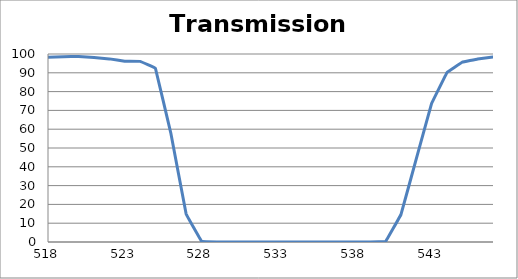
| Category | Transmission (%) |
|---|---|
| 2600.0 | 66.434 |
| 2599.0 | 66.421 |
| 2598.0 | 66.411 |
| 2597.0 | 66.37 |
| 2596.0 | 66.272 |
| 2595.0 | 66.179 |
| 2594.0 | 66.079 |
| 2593.0 | 65.983 |
| 2592.0 | 65.845 |
| 2591.0 | 65.765 |
| 2590.0 | 65.655 |
| 2589.0 | 65.601 |
| 2588.0 | 65.577 |
| 2587.0 | 65.482 |
| 2586.0 | 65.346 |
| 2585.0 | 65.191 |
| 2584.0 | 65.07 |
| 2583.0 | 64.915 |
| 2582.0 | 64.859 |
| 2581.0 | 64.767 |
| 2580.0 | 64.738 |
| 2579.0 | 64.683 |
| 2578.0 | 64.631 |
| 2577.0 | 64.623 |
| 2576.0 | 64.59 |
| 2575.0 | 64.598 |
| 2574.0 | 64.605 |
| 2573.0 | 64.634 |
| 2572.0 | 64.678 |
| 2571.0 | 64.774 |
| 2570.0 | 64.857 |
| 2569.0 | 65.033 |
| 2568.0 | 65.207 |
| 2567.0 | 65.389 |
| 2566.0 | 65.6 |
| 2565.0 | 65.81 |
| 2564.0 | 66.028 |
| 2563.0 | 66.29 |
| 2562.0 | 66.575 |
| 2561.0 | 66.826 |
| 2560.0 | 67.062 |
| 2559.0 | 67.328 |
| 2558.0 | 67.622 |
| 2557.0 | 67.91 |
| 2556.0 | 68.236 |
| 2555.0 | 68.53 |
| 2554.0 | 68.852 |
| 2553.0 | 69.226 |
| 2552.0 | 69.63 |
| 2551.0 | 70.064 |
| 2550.0 | 70.535 |
| 2549.0 | 70.997 |
| 2548.0 | 71.46 |
| 2547.0 | 71.886 |
| 2546.0 | 72.279 |
| 2545.0 | 72.675 |
| 2544.0 | 73.071 |
| 2543.0 | 73.428 |
| 2542.0 | 73.762 |
| 2541.0 | 74.049 |
| 2540.0 | 74.321 |
| 2539.0 | 74.558 |
| 2538.0 | 74.798 |
| 2537.0 | 75.017 |
| 2536.0 | 75.232 |
| 2535.0 | 75.435 |
| 2534.0 | 75.586 |
| 2533.0 | 75.68 |
| 2532.0 | 75.816 |
| 2531.0 | 75.972 |
| 2530.0 | 76.04 |
| 2529.0 | 76.068 |
| 2528.0 | 76.114 |
| 2527.0 | 76.123 |
| 2526.0 | 76.093 |
| 2525.0 | 76.093 |
| 2524.0 | 76.089 |
| 2523.0 | 76.062 |
| 2522.0 | 75.999 |
| 2521.0 | 75.884 |
| 2520.0 | 75.782 |
| 2519.0 | 75.693 |
| 2518.0 | 75.581 |
| 2517.0 | 75.5 |
| 2516.0 | 75.422 |
| 2515.0 | 75.315 |
| 2514.0 | 75.215 |
| 2513.0 | 75.152 |
| 2512.0 | 75.091 |
| 2511.0 | 75.052 |
| 2510.0 | 75.006 |
| 2509.0 | 74.962 |
| 2508.0 | 74.939 |
| 2507.0 | 74.938 |
| 2506.0 | 74.953 |
| 2505.0 | 75.004 |
| 2504.0 | 75.059 |
| 2503.0 | 75.132 |
| 2502.0 | 75.2 |
| 2501.0 | 75.283 |
| 2500.0 | 75.403 |
| 2499.0 | 75.562 |
| 2498.0 | 75.76 |
| 2497.0 | 75.947 |
| 2496.0 | 76.165 |
| 2495.0 | 76.369 |
| 2494.0 | 76.574 |
| 2493.0 | 76.79 |
| 2492.0 | 77.05 |
| 2491.0 | 77.321 |
| 2490.0 | 77.625 |
| 2489.0 | 77.936 |
| 2488.0 | 78.25 |
| 2487.0 | 78.537 |
| 2486.0 | 78.805 |
| 2485.0 | 79.115 |
| 2484.0 | 79.486 |
| 2483.0 | 79.818 |
| 2482.0 | 80.132 |
| 2481.0 | 80.444 |
| 2480.0 | 80.758 |
| 2479.0 | 81.055 |
| 2478.0 | 81.355 |
| 2477.0 | 81.637 |
| 2476.0 | 81.93 |
| 2475.0 | 82.203 |
| 2474.0 | 82.478 |
| 2473.0 | 82.719 |
| 2472.0 | 82.942 |
| 2471.0 | 83.151 |
| 2470.0 | 83.367 |
| 2469.0 | 83.612 |
| 2468.0 | 83.813 |
| 2467.0 | 83.938 |
| 2466.0 | 84.035 |
| 2465.0 | 84.149 |
| 2464.0 | 84.264 |
| 2463.0 | 84.37 |
| 2462.0 | 84.465 |
| 2461.0 | 84.518 |
| 2460.0 | 84.539 |
| 2459.0 | 84.569 |
| 2458.0 | 84.616 |
| 2457.0 | 84.636 |
| 2456.0 | 84.661 |
| 2455.0 | 84.658 |
| 2454.0 | 84.645 |
| 2453.0 | 84.64 |
| 2452.0 | 84.627 |
| 2451.0 | 84.613 |
| 2450.0 | 84.592 |
| 2449.0 | 84.587 |
| 2448.0 | 84.603 |
| 2447.0 | 84.599 |
| 2446.0 | 84.56 |
| 2445.0 | 84.529 |
| 2444.0 | 84.517 |
| 2443.0 | 84.516 |
| 2442.0 | 84.509 |
| 2441.0 | 84.491 |
| 2440.0 | 84.468 |
| 2439.0 | 84.43 |
| 2438.0 | 84.389 |
| 2437.0 | 84.36 |
| 2436.0 | 84.349 |
| 2435.0 | 84.354 |
| 2434.0 | 84.358 |
| 2433.0 | 84.343 |
| 2432.0 | 84.296 |
| 2431.0 | 84.261 |
| 2430.0 | 84.234 |
| 2429.0 | 84.196 |
| 2428.0 | 84.148 |
| 2427.0 | 84.099 |
| 2426.0 | 84.054 |
| 2425.0 | 84.013 |
| 2424.0 | 83.953 |
| 2423.0 | 83.88 |
| 2422.0 | 83.817 |
| 2421.0 | 83.74 |
| 2420.0 | 83.644 |
| 2419.0 | 83.565 |
| 2418.0 | 83.498 |
| 2417.0 | 83.429 |
| 2416.0 | 83.373 |
| 2415.0 | 83.31 |
| 2414.0 | 83.22 |
| 2413.0 | 83.133 |
| 2412.0 | 83.039 |
| 2411.0 | 82.941 |
| 2410.0 | 82.878 |
| 2409.0 | 82.847 |
| 2408.0 | 82.804 |
| 2407.0 | 82.774 |
| 2406.0 | 82.75 |
| 2405.0 | 82.709 |
| 2404.0 | 82.7 |
| 2403.0 | 82.714 |
| 2402.0 | 82.738 |
| 2401.0 | 82.771 |
| 2400.0 | 82.816 |
| 2399.0 | 82.879 |
| 2398.0 | 82.948 |
| 2397.0 | 83.026 |
| 2396.0 | 83.115 |
| 2395.0 | 83.217 |
| 2394.0 | 83.338 |
| 2393.0 | 83.478 |
| 2392.0 | 83.615 |
| 2391.0 | 83.748 |
| 2390.0 | 83.881 |
| 2389.0 | 84.023 |
| 2388.0 | 84.167 |
| 2387.0 | 84.329 |
| 2386.0 | 84.498 |
| 2385.0 | 84.638 |
| 2384.0 | 84.75 |
| 2383.0 | 84.833 |
| 2382.0 | 84.913 |
| 2381.0 | 85.001 |
| 2380.0 | 85.062 |
| 2379.0 | 85.103 |
| 2378.0 | 85.121 |
| 2377.0 | 85.108 |
| 2376.0 | 85.046 |
| 2375.0 | 84.941 |
| 2374.0 | 84.823 |
| 2373.0 | 84.702 |
| 2372.0 | 84.563 |
| 2371.0 | 84.377 |
| 2370.0 | 84.13 |
| 2369.0 | 83.846 |
| 2368.0 | 83.532 |
| 2367.0 | 83.193 |
| 2366.0 | 82.855 |
| 2365.0 | 82.492 |
| 2364.0 | 82.087 |
| 2363.0 | 81.673 |
| 2362.0 | 81.256 |
| 2361.0 | 80.802 |
| 2360.0 | 80.333 |
| 2359.0 | 79.852 |
| 2358.0 | 79.373 |
| 2357.0 | 78.897 |
| 2356.0 | 78.416 |
| 2355.0 | 77.975 |
| 2354.0 | 77.522 |
| 2353.0 | 77.078 |
| 2352.0 | 76.658 |
| 2351.0 | 76.265 |
| 2350.0 | 75.892 |
| 2349.0 | 75.546 |
| 2348.0 | 75.243 |
| 2347.0 | 74.993 |
| 2346.0 | 74.765 |
| 2345.0 | 74.557 |
| 2344.0 | 74.387 |
| 2343.0 | 74.244 |
| 2342.0 | 74.135 |
| 2341.0 | 74.063 |
| 2340.0 | 74.053 |
| 2339.0 | 74.085 |
| 2338.0 | 74.153 |
| 2337.0 | 74.242 |
| 2336.0 | 74.359 |
| 2335.0 | 74.496 |
| 2334.0 | 74.667 |
| 2333.0 | 74.882 |
| 2332.0 | 75.154 |
| 2331.0 | 75.424 |
| 2330.0 | 75.696 |
| 2329.0 | 75.983 |
| 2328.0 | 76.295 |
| 2327.0 | 76.618 |
| 2326.0 | 76.935 |
| 2325.0 | 77.264 |
| 2324.0 | 77.596 |
| 2323.0 | 77.926 |
| 2322.0 | 78.231 |
| 2321.0 | 78.498 |
| 2320.0 | 78.743 |
| 2319.0 | 78.975 |
| 2318.0 | 79.182 |
| 2317.0 | 79.339 |
| 2316.0 | 79.474 |
| 2315.0 | 79.559 |
| 2314.0 | 79.581 |
| 2313.0 | 79.551 |
| 2312.0 | 79.483 |
| 2311.0 | 79.365 |
| 2310.0 | 79.232 |
| 2309.0 | 79.049 |
| 2308.0 | 78.807 |
| 2307.0 | 78.511 |
| 2306.0 | 78.178 |
| 2305.0 | 77.792 |
| 2304.0 | 77.407 |
| 2303.0 | 77.005 |
| 2302.0 | 76.577 |
| 2301.0 | 76.127 |
| 2300.0 | 75.678 |
| 2299.0 | 75.244 |
| 2298.0 | 74.794 |
| 2297.0 | 74.326 |
| 2296.0 | 73.903 |
| 2295.0 | 73.494 |
| 2294.0 | 73.103 |
| 2293.0 | 72.698 |
| 2292.0 | 72.378 |
| 2291.0 | 72.061 |
| 2290.0 | 71.785 |
| 2289.0 | 71.52 |
| 2288.0 | 71.275 |
| 2287.0 | 71.067 |
| 2286.0 | 70.894 |
| 2285.0 | 70.77 |
| 2284.0 | 70.676 |
| 2283.0 | 70.623 |
| 2282.0 | 70.607 |
| 2281.0 | 70.619 |
| 2280.0 | 70.655 |
| 2279.0 | 70.721 |
| 2278.0 | 70.811 |
| 2277.0 | 70.926 |
| 2276.0 | 71.062 |
| 2275.0 | 71.22 |
| 2274.0 | 71.379 |
| 2273.0 | 71.546 |
| 2272.0 | 71.733 |
| 2271.0 | 71.912 |
| 2270.0 | 72.052 |
| 2269.0 | 72.2 |
| 2268.0 | 72.29 |
| 2267.0 | 72.368 |
| 2266.0 | 72.436 |
| 2265.0 | 72.458 |
| 2264.0 | 72.439 |
| 2263.0 | 72.363 |
| 2262.0 | 72.284 |
| 2261.0 | 72.157 |
| 2260.0 | 71.981 |
| 2259.0 | 71.756 |
| 2258.0 | 71.47 |
| 2257.0 | 71.141 |
| 2256.0 | 70.784 |
| 2255.0 | 70.396 |
| 2254.0 | 69.976 |
| 2253.0 | 69.54 |
| 2252.0 | 69.064 |
| 2251.0 | 68.568 |
| 2250.0 | 68.101 |
| 2249.0 | 67.613 |
| 2248.0 | 67.126 |
| 2247.0 | 66.649 |
| 2246.0 | 66.145 |
| 2245.0 | 65.664 |
| 2244.0 | 65.193 |
| 2243.0 | 64.769 |
| 2242.0 | 64.317 |
| 2241.0 | 63.988 |
| 2240.0 | 63.66 |
| 2239.0 | 63.351 |
| 2238.0 | 63.035 |
| 2237.0 | 62.779 |
| 2236.0 | 62.569 |
| 2235.0 | 62.388 |
| 2234.0 | 62.226 |
| 2233.0 | 62.117 |
| 2232.0 | 62.085 |
| 2231.0 | 62.055 |
| 2230.0 | 62.021 |
| 2229.0 | 62.001 |
| 2228.0 | 62.04 |
| 2227.0 | 62.096 |
| 2226.0 | 62.176 |
| 2225.0 | 62.241 |
| 2224.0 | 62.336 |
| 2223.0 | 62.42 |
| 2222.0 | 62.503 |
| 2221.0 | 62.616 |
| 2220.0 | 62.727 |
| 2219.0 | 62.82 |
| 2218.0 | 62.919 |
| 2217.0 | 63.002 |
| 2216.0 | 63.153 |
| 2215.0 | 63.21 |
| 2214.0 | 63.277 |
| 2213.0 | 63.35 |
| 2212.0 | 63.413 |
| 2211.0 | 63.51 |
| 2210.0 | 63.592 |
| 2209.0 | 63.669 |
| 2208.0 | 63.814 |
| 2207.0 | 63.918 |
| 2206.0 | 64.047 |
| 2205.0 | 64.206 |
| 2204.0 | 64.379 |
| 2203.0 | 64.547 |
| 2202.0 | 64.717 |
| 2201.0 | 64.89 |
| 2200.0 | 65.028 |
| 2199.0 | 65.172 |
| 2198.0 | 65.283 |
| 2197.0 | 65.401 |
| 2196.0 | 65.481 |
| 2195.0 | 65.521 |
| 2194.0 | 65.538 |
| 2193.0 | 65.584 |
| 2192.0 | 65.621 |
| 2191.0 | 65.595 |
| 2190.0 | 65.564 |
| 2189.0 | 65.545 |
| 2188.0 | 65.53 |
| 2187.0 | 65.574 |
| 2186.0 | 65.647 |
| 2185.0 | 65.713 |
| 2184.0 | 65.758 |
| 2183.0 | 65.851 |
| 2182.0 | 66.036 |
| 2181.0 | 66.202 |
| 2180.0 | 66.364 |
| 2179.0 | 66.59 |
| 2178.0 | 66.865 |
| 2177.0 | 67.11 |
| 2176.0 | 67.379 |
| 2175.0 | 67.653 |
| 2174.0 | 67.974 |
| 2173.0 | 68.317 |
| 2172.0 | 68.632 |
| 2171.0 | 68.913 |
| 2170.0 | 69.199 |
| 2169.0 | 69.468 |
| 2168.0 | 69.718 |
| 2167.0 | 69.967 |
| 2166.0 | 70.136 |
| 2165.0 | 70.285 |
| 2164.0 | 70.385 |
| 2163.0 | 70.432 |
| 2162.0 | 70.468 |
| 2161.0 | 70.453 |
| 2160.0 | 70.373 |
| 2159.0 | 70.253 |
| 2158.0 | 70.077 |
| 2157.0 | 69.864 |
| 2156.0 | 69.645 |
| 2155.0 | 69.357 |
| 2154.0 | 69.049 |
| 2153.0 | 68.742 |
| 2152.0 | 68.477 |
| 2151.0 | 68.192 |
| 2150.0 | 67.869 |
| 2149.0 | 67.58 |
| 2148.0 | 67.326 |
| 2147.0 | 67.091 |
| 2146.0 | 66.907 |
| 2145.0 | 66.74 |
| 2144.0 | 66.611 |
| 2143.0 | 66.56 |
| 2142.0 | 66.561 |
| 2141.0 | 66.586 |
| 2140.0 | 66.691 |
| 2139.0 | 66.857 |
| 2138.0 | 67.096 |
| 2137.0 | 67.382 |
| 2136.0 | 67.715 |
| 2135.0 | 68.099 |
| 2134.0 | 68.553 |
| 2133.0 | 69.09 |
| 2132.0 | 69.637 |
| 2131.0 | 70.23 |
| 2130.0 | 70.84 |
| 2129.0 | 71.486 |
| 2128.0 | 72.185 |
| 2127.0 | 72.841 |
| 2126.0 | 73.523 |
| 2125.0 | 74.196 |
| 2124.0 | 74.86 |
| 2123.0 | 75.491 |
| 2122.0 | 76.017 |
| 2121.0 | 76.491 |
| 2120.0 | 76.889 |
| 2119.0 | 77.22 |
| 2118.0 | 77.419 |
| 2117.0 | 77.497 |
| 2116.0 | 77.485 |
| 2115.0 | 77.328 |
| 2114.0 | 77.062 |
| 2113.0 | 76.692 |
| 2112.0 | 76.181 |
| 2111.0 | 75.58 |
| 2110.0 | 74.921 |
| 2109.0 | 74.189 |
| 2108.0 | 73.363 |
| 2107.0 | 72.519 |
| 2106.0 | 71.656 |
| 2105.0 | 70.773 |
| 2104.0 | 69.948 |
| 2103.0 | 69.087 |
| 2102.0 | 68.284 |
| 2101.0 | 67.513 |
| 2100.0 | 66.815 |
| 2099.0 | 66.179 |
| 2098.0 | 65.607 |
| 2097.0 | 65.077 |
| 2096.0 | 64.661 |
| 2095.0 | 64.33 |
| 2094.0 | 64.076 |
| 2093.0 | 63.884 |
| 2092.0 | 63.803 |
| 2091.0 | 63.831 |
| 2090.0 | 63.94 |
| 2089.0 | 64.138 |
| 2088.0 | 64.396 |
| 2087.0 | 64.751 |
| 2086.0 | 65.213 |
| 2085.0 | 65.773 |
| 2084.0 | 66.348 |
| 2083.0 | 67.015 |
| 2082.0 | 67.737 |
| 2081.0 | 68.504 |
| 2080.0 | 69.349 |
| 2079.0 | 70.169 |
| 2078.0 | 70.994 |
| 2077.0 | 71.815 |
| 2076.0 | 72.637 |
| 2075.0 | 73.432 |
| 2074.0 | 74.17 |
| 2073.0 | 74.789 |
| 2072.0 | 75.328 |
| 2071.0 | 75.766 |
| 2070.0 | 76.09 |
| 2069.0 | 76.297 |
| 2068.0 | 76.369 |
| 2067.0 | 76.305 |
| 2066.0 | 76.122 |
| 2065.0 | 75.836 |
| 2064.0 | 75.468 |
| 2063.0 | 75.017 |
| 2062.0 | 74.462 |
| 2061.0 | 73.865 |
| 2060.0 | 73.2 |
| 2059.0 | 72.549 |
| 2058.0 | 71.917 |
| 2057.0 | 71.258 |
| 2056.0 | 70.627 |
| 2055.0 | 70.002 |
| 2054.0 | 69.441 |
| 2053.0 | 68.967 |
| 2052.0 | 68.524 |
| 2051.0 | 68.151 |
| 2050.0 | 67.892 |
| 2049.0 | 67.699 |
| 2048.0 | 67.568 |
| 2047.0 | 67.524 |
| 2046.0 | 67.585 |
| 2045.0 | 67.756 |
| 2044.0 | 67.998 |
| 2043.0 | 68.322 |
| 2042.0 | 68.712 |
| 2041.0 | 69.21 |
| 2040.0 | 69.794 |
| 2039.0 | 70.4 |
| 2038.0 | 71.073 |
| 2037.0 | 71.792 |
| 2036.0 | 72.543 |
| 2035.0 | 73.286 |
| 2034.0 | 74.026 |
| 2033.0 | 74.721 |
| 2032.0 | 75.366 |
| 2031.0 | 76.001 |
| 2030.0 | 76.547 |
| 2029.0 | 76.97 |
| 2028.0 | 77.277 |
| 2027.0 | 77.485 |
| 2026.0 | 77.577 |
| 2025.0 | 77.543 |
| 2024.0 | 77.37 |
| 2023.0 | 77.099 |
| 2022.0 | 76.763 |
| 2021.0 | 76.301 |
| 2020.0 | 75.742 |
| 2019.0 | 75.15 |
| 2018.0 | 74.5 |
| 2017.0 | 73.852 |
| 2016.0 | 73.233 |
| 2015.0 | 72.597 |
| 2014.0 | 71.946 |
| 2013.0 | 71.332 |
| 2012.0 | 70.807 |
| 2011.0 | 70.337 |
| 2010.0 | 69.901 |
| 2009.0 | 69.523 |
| 2008.0 | 69.228 |
| 2007.0 | 68.993 |
| 2006.0 | 68.843 |
| 2005.0 | 68.781 |
| 2004.0 | 68.788 |
| 2003.0 | 68.861 |
| 2002.0 | 69.017 |
| 2001.0 | 69.259 |
| 2000.0 | 69.531 |
| 1999.0 | 69.833 |
| 1998.0 | 70.182 |
| 1997.0 | 70.52 |
| 1996.0 | 70.875 |
| 1995.0 | 71.213 |
| 1994.0 | 71.477 |
| 1993.0 | 71.678 |
| 1992.0 | 71.808 |
| 1991.0 | 71.817 |
| 1990.0 | 71.73 |
| 1989.0 | 71.51 |
| 1988.0 | 71.164 |
| 1987.0 | 70.683 |
| 1986.0 | 70.055 |
| 1985.0 | 69.314 |
| 1984.0 | 68.463 |
| 1983.0 | 67.507 |
| 1982.0 | 66.491 |
| 1981.0 | 65.416 |
| 1980.0 | 64.297 |
| 1979.0 | 63.177 |
| 1978.0 | 62.081 |
| 1977.0 | 60.995 |
| 1976.0 | 59.949 |
| 1975.0 | 58.958 |
| 1974.0 | 58.016 |
| 1973.0 | 57.122 |
| 1972.0 | 56.316 |
| 1971.0 | 55.622 |
| 1970.0 | 55.023 |
| 1969.0 | 54.503 |
| 1968.0 | 54.098 |
| 1967.0 | 53.823 |
| 1966.0 | 53.657 |
| 1965.0 | 53.588 |
| 1964.0 | 53.616 |
| 1963.0 | 53.795 |
| 1962.0 | 54.088 |
| 1961.0 | 54.508 |
| 1960.0 | 55.067 |
| 1959.0 | 55.683 |
| 1958.0 | 56.439 |
| 1957.0 | 57.363 |
| 1956.0 | 58.348 |
| 1955.0 | 59.395 |
| 1954.0 | 60.491 |
| 1953.0 | 61.668 |
| 1952.0 | 62.963 |
| 1951.0 | 64.165 |
| 1950.0 | 65.41 |
| 1949.0 | 66.58 |
| 1948.0 | 67.756 |
| 1947.0 | 68.81 |
| 1946.0 | 69.762 |
| 1945.0 | 70.564 |
| 1944.0 | 71.238 |
| 1943.0 | 71.775 |
| 1942.0 | 72.152 |
| 1941.0 | 72.301 |
| 1940.0 | 72.272 |
| 1939.0 | 72.122 |
| 1938.0 | 71.835 |
| 1937.0 | 71.473 |
| 1936.0 | 71.025 |
| 1935.0 | 70.51 |
| 1934.0 | 69.902 |
| 1933.0 | 69.296 |
| 1932.0 | 68.646 |
| 1931.0 | 68.062 |
| 1930.0 | 67.45 |
| 1929.0 | 66.86 |
| 1928.0 | 66.335 |
| 1927.0 | 65.877 |
| 1926.0 | 65.509 |
| 1925.0 | 65.235 |
| 1924.0 | 65.077 |
| 1923.0 | 64.995 |
| 1922.0 | 64.969 |
| 1921.0 | 65.018 |
| 1920.0 | 65.14 |
| 1919.0 | 65.404 |
| 1918.0 | 65.782 |
| 1917.0 | 66.241 |
| 1916.0 | 66.739 |
| 1915.0 | 67.268 |
| 1914.0 | 67.899 |
| 1913.0 | 68.514 |
| 1912.0 | 69.199 |
| 1911.0 | 69.906 |
| 1910.0 | 70.59 |
| 1909.0 | 71.242 |
| 1908.0 | 71.904 |
| 1907.0 | 72.575 |
| 1906.0 | 73.286 |
| 1905.0 | 73.915 |
| 1904.0 | 74.449 |
| 1903.0 | 74.986 |
| 1902.0 | 75.509 |
| 1901.0 | 76.011 |
| 1900.0 | 76.558 |
| 1899.0 | 77.039 |
| 1898.0 | 77.465 |
| 1897.0 | 78.019 |
| 1896.0 | 78.476 |
| 1895.0 | 78.941 |
| 1894.0 | 79.53 |
| 1893.0 | 80.091 |
| 1892.0 | 80.671 |
| 1891.0 | 81.301 |
| 1890.0 | 81.906 |
| 1889.0 | 82.562 |
| 1888.0 | 83.262 |
| 1887.0 | 83.926 |
| 1886.0 | 84.545 |
| 1885.0 | 85.2 |
| 1884.0 | 85.785 |
| 1883.0 | 86.347 |
| 1882.0 | 86.708 |
| 1881.0 | 87.014 |
| 1880.0 | 87.212 |
| 1879.0 | 87.221 |
| 1878.0 | 87.023 |
| 1877.0 | 86.608 |
| 1876.0 | 86.068 |
| 1875.0 | 85.22 |
| 1874.0 | 84.229 |
| 1873.0 | 83.011 |
| 1872.0 | 81.557 |
| 1871.0 | 80.185 |
| 1870.0 | 78.62 |
| 1869.0 | 77.038 |
| 1868.0 | 75.531 |
| 1867.0 | 74.104 |
| 1866.0 | 72.822 |
| 1865.0 | 71.669 |
| 1864.0 | 70.581 |
| 1863.0 | 69.6 |
| 1862.0 | 68.718 |
| 1861.0 | 67.833 |
| 1860.0 | 67.092 |
| 1859.0 | 66.547 |
| 1858.0 | 66.245 |
| 1857.0 | 66.178 |
| 1856.0 | 66.251 |
| 1855.0 | 66.495 |
| 1854.0 | 66.982 |
| 1853.0 | 67.579 |
| 1852.0 | 68.367 |
| 1851.0 | 69.251 |
| 1850.0 | 70.198 |
| 1849.0 | 71.586 |
| 1848.0 | 73.199 |
| 1847.0 | 74.99 |
| 1846.0 | 76.672 |
| 1845.0 | 78.016 |
| 1844.0 | 79.572 |
| 1843.0 | 81.242 |
| 1842.0 | 82.927 |
| 1841.0 | 84.546 |
| 1840.0 | 85.852 |
| 1839.0 | 86.987 |
| 1838.0 | 87.685 |
| 1837.0 | 88.208 |
| 1836.0 | 88.392 |
| 1835.0 | 88.289 |
| 1834.0 | 87.967 |
| 1833.0 | 87.345 |
| 1832.0 | 86.442 |
| 1831.0 | 85.343 |
| 1830.0 | 84.065 |
| 1829.0 | 82.678 |
| 1828.0 | 81.44 |
| 1827.0 | 80.111 |
| 1826.0 | 78.805 |
| 1825.0 | 77.794 |
| 1824.0 | 76.93 |
| 1823.0 | 76.303 |
| 1822.0 | 75.681 |
| 1821.0 | 75.135 |
| 1820.0 | 74.778 |
| 1819.0 | 74.711 |
| 1818.0 | 74.885 |
| 1817.0 | 75.201 |
| 1816.0 | 75.762 |
| 1815.0 | 76.465 |
| 1814.0 | 77.229 |
| 1813.0 | 78.187 |
| 1812.0 | 79.305 |
| 1811.0 | 80.488 |
| 1810.0 | 81.771 |
| 1809.0 | 83.065 |
| 1808.0 | 84.247 |
| 1807.0 | 85.39 |
| 1806.0 | 86.539 |
| 1805.0 | 87.526 |
| 1804.0 | 88.373 |
| 1803.0 | 88.99 |
| 1802.0 | 89.381 |
| 1801.0 | 89.47 |
| 1800.0 | 89.261 |
| 1799.0 | 88.946 |
| 1798.0 | 88.373 |
| 1797.0 | 87.711 |
| 1796.0 | 86.823 |
| 1795.0 | 85.855 |
| 1794.0 | 84.838 |
| 1793.0 | 83.825 |
| 1792.0 | 82.825 |
| 1791.0 | 81.928 |
| 1790.0 | 81.114 |
| 1789.0 | 80.456 |
| 1788.0 | 79.925 |
| 1787.0 | 79.547 |
| 1786.0 | 79.301 |
| 1785.0 | 79.218 |
| 1784.0 | 79.295 |
| 1783.0 | 79.544 |
| 1782.0 | 79.907 |
| 1781.0 | 80.443 |
| 1780.0 | 81.058 |
| 1779.0 | 81.677 |
| 1778.0 | 82.433 |
| 1777.0 | 83.113 |
| 1776.0 | 83.823 |
| 1775.0 | 84.465 |
| 1774.0 | 84.995 |
| 1773.0 | 85.428 |
| 1772.0 | 85.746 |
| 1771.0 | 85.913 |
| 1770.0 | 85.947 |
| 1769.0 | 85.75 |
| 1768.0 | 85.396 |
| 1767.0 | 84.857 |
| 1766.0 | 84.174 |
| 1765.0 | 83.388 |
| 1764.0 | 82.518 |
| 1763.0 | 81.603 |
| 1762.0 | 80.682 |
| 1761.0 | 79.761 |
| 1760.0 | 78.866 |
| 1759.0 | 78.047 |
| 1758.0 | 77.319 |
| 1757.0 | 76.714 |
| 1756.0 | 76.202 |
| 1755.0 | 75.86 |
| 1754.0 | 75.661 |
| 1753.0 | 75.619 |
| 1752.0 | 75.75 |
| 1751.0 | 75.998 |
| 1750.0 | 76.368 |
| 1749.0 | 76.883 |
| 1748.0 | 77.483 |
| 1747.0 | 78.184 |
| 1746.0 | 78.949 |
| 1745.0 | 79.765 |
| 1744.0 | 80.6 |
| 1743.0 | 81.417 |
| 1742.0 | 82.215 |
| 1741.0 | 82.939 |
| 1740.0 | 83.616 |
| 1739.0 | 84.174 |
| 1738.0 | 84.644 |
| 1737.0 | 85.017 |
| 1736.0 | 85.289 |
| 1735.0 | 85.461 |
| 1734.0 | 85.571 |
| 1733.0 | 85.62 |
| 1732.0 | 85.619 |
| 1731.0 | 85.585 |
| 1730.0 | 85.54 |
| 1729.0 | 85.513 |
| 1728.0 | 85.517 |
| 1727.0 | 85.519 |
| 1726.0 | 85.607 |
| 1725.0 | 85.729 |
| 1724.0 | 85.95 |
| 1723.0 | 86.234 |
| 1722.0 | 86.575 |
| 1721.0 | 86.963 |
| 1720.0 | 87.435 |
| 1719.0 | 87.965 |
| 1718.0 | 88.486 |
| 1717.0 | 88.994 |
| 1716.0 | 89.503 |
| 1715.0 | 89.994 |
| 1714.0 | 90.405 |
| 1713.0 | 90.72 |
| 1712.0 | 90.961 |
| 1711.0 | 91.08 |
| 1710.0 | 91.144 |
| 1709.0 | 91.102 |
| 1708.0 | 90.952 |
| 1707.0 | 90.742 |
| 1706.0 | 90.474 |
| 1705.0 | 90.173 |
| 1704.0 | 89.854 |
| 1703.0 | 89.561 |
| 1702.0 | 89.296 |
| 1701.0 | 89.08 |
| 1700.0 | 88.918 |
| 1699.0 | 88.837 |
| 1698.0 | 88.819 |
| 1697.0 | 88.846 |
| 1696.0 | 88.936 |
| 1695.0 | 89.087 |
| 1694.0 | 89.302 |
| 1693.0 | 89.54 |
| 1692.0 | 89.787 |
| 1691.0 | 90.011 |
| 1690.0 | 90.157 |
| 1689.0 | 90.248 |
| 1688.0 | 90.253 |
| 1687.0 | 90.127 |
| 1686.0 | 89.863 |
| 1685.0 | 89.46 |
| 1684.0 | 88.913 |
| 1683.0 | 88.236 |
| 1682.0 | 87.438 |
| 1681.0 | 86.526 |
| 1680.0 | 85.566 |
| 1679.0 | 84.597 |
| 1678.0 | 83.596 |
| 1677.0 | 82.641 |
| 1676.0 | 81.754 |
| 1675.0 | 80.992 |
| 1674.0 | 80.364 |
| 1673.0 | 79.888 |
| 1672.0 | 79.599 |
| 1671.0 | 79.499 |
| 1670.0 | 79.597 |
| 1669.0 | 79.876 |
| 1668.0 | 80.343 |
| 1667.0 | 80.981 |
| 1666.0 | 81.763 |
| 1665.0 | 82.678 |
| 1664.0 | 83.695 |
| 1663.0 | 84.734 |
| 1662.0 | 85.77 |
| 1661.0 | 86.751 |
| 1660.0 | 87.628 |
| 1659.0 | 88.36 |
| 1658.0 | 88.897 |
| 1657.0 | 89.194 |
| 1656.0 | 89.256 |
| 1655.0 | 89.078 |
| 1654.0 | 88.664 |
| 1653.0 | 88.033 |
| 1652.0 | 87.231 |
| 1651.0 | 86.297 |
| 1650.0 | 85.25 |
| 1649.0 | 84.178 |
| 1648.0 | 83.152 |
| 1647.0 | 82.161 |
| 1646.0 | 81.297 |
| 1645.0 | 80.618 |
| 1644.0 | 80.082 |
| 1643.0 | 79.729 |
| 1642.0 | 79.601 |
| 1641.0 | 79.723 |
| 1640.0 | 80.107 |
| 1639.0 | 80.737 |
| 1638.0 | 81.592 |
| 1637.0 | 82.629 |
| 1636.0 | 83.837 |
| 1635.0 | 85.19 |
| 1634.0 | 86.602 |
| 1633.0 | 88.055 |
| 1632.0 | 89.475 |
| 1631.0 | 90.744 |
| 1630.0 | 91.819 |
| 1629.0 | 92.643 |
| 1628.0 | 93.181 |
| 1627.0 | 93.437 |
| 1626.0 | 93.39 |
| 1625.0 | 93.049 |
| 1624.0 | 92.467 |
| 1623.0 | 91.737 |
| 1622.0 | 90.868 |
| 1621.0 | 89.895 |
| 1620.0 | 88.94 |
| 1619.0 | 88.031 |
| 1618.0 | 87.219 |
| 1617.0 | 86.541 |
| 1616.0 | 86.02 |
| 1615.0 | 85.668 |
| 1614.0 | 85.52 |
| 1613.0 | 85.544 |
| 1612.0 | 85.753 |
| 1611.0 | 86.119 |
| 1610.0 | 86.615 |
| 1609.0 | 87.215 |
| 1608.0 | 87.841 |
| 1607.0 | 88.503 |
| 1606.0 | 89.156 |
| 1605.0 | 89.704 |
| 1604.0 | 90.136 |
| 1603.0 | 90.41 |
| 1602.0 | 90.46 |
| 1601.0 | 90.303 |
| 1600.0 | 89.959 |
| 1599.0 | 89.42 |
| 1598.0 | 88.727 |
| 1597.0 | 87.945 |
| 1596.0 | 87.1 |
| 1595.0 | 86.232 |
| 1594.0 | 85.451 |
| 1593.0 | 84.751 |
| 1592.0 | 84.178 |
| 1591.0 | 83.788 |
| 1590.0 | 83.61 |
| 1589.0 | 83.618 |
| 1588.0 | 83.778 |
| 1587.0 | 84.138 |
| 1586.0 | 84.655 |
| 1585.0 | 85.287 |
| 1584.0 | 85.995 |
| 1583.0 | 86.672 |
| 1582.0 | 87.286 |
| 1581.0 | 87.807 |
| 1580.0 | 88.17 |
| 1579.0 | 88.329 |
| 1578.0 | 88.253 |
| 1577.0 | 87.965 |
| 1576.0 | 87.434 |
| 1575.0 | 86.68 |
| 1574.0 | 85.771 |
| 1573.0 | 84.748 |
| 1572.0 | 83.645 |
| 1571.0 | 82.53 |
| 1570.0 | 81.477 |
| 1569.0 | 80.524 |
| 1568.0 | 79.72 |
| 1567.0 | 79.078 |
| 1566.0 | 78.65 |
| 1565.0 | 78.461 |
| 1564.0 | 78.54 |
| 1563.0 | 78.81 |
| 1562.0 | 79.303 |
| 1561.0 | 80.008 |
| 1560.0 | 80.844 |
| 1559.0 | 81.846 |
| 1558.0 | 82.85 |
| 1557.0 | 83.777 |
| 1556.0 | 84.595 |
| 1555.0 | 85.18 |
| 1554.0 | 85.517 |
| 1553.0 | 85.551 |
| 1552.0 | 85.262 |
| 1551.0 | 84.611 |
| 1550.0 | 83.746 |
| 1549.0 | 82.608 |
| 1548.0 | 81.308 |
| 1547.0 | 79.922 |
| 1546.0 | 78.563 |
| 1545.0 | 77.319 |
| 1544.0 | 76.232 |
| 1543.0 | 75.345 |
| 1542.0 | 74.695 |
| 1541.0 | 74.303 |
| 1540.0 | 74.241 |
| 1539.0 | 74.474 |
| 1538.0 | 74.985 |
| 1537.0 | 75.761 |
| 1536.0 | 76.794 |
| 1535.0 | 78.061 |
| 1534.0 | 79.46 |
| 1533.0 | 80.999 |
| 1532.0 | 82.592 |
| 1531.0 | 84.095 |
| 1530.0 | 85.522 |
| 1529.0 | 86.729 |
| 1528.0 | 87.681 |
| 1527.0 | 88.323 |
| 1526.0 | 88.607 |
| 1525.0 | 88.559 |
| 1524.0 | 88.181 |
| 1523.0 | 87.562 |
| 1522.0 | 86.747 |
| 1521.0 | 85.858 |
| 1520.0 | 84.952 |
| 1519.0 | 84.035 |
| 1518.0 | 83.301 |
| 1517.0 | 82.714 |
| 1516.0 | 82.311 |
| 1515.0 | 82.118 |
| 1514.0 | 82.146 |
| 1513.0 | 82.356 |
| 1512.0 | 82.703 |
| 1511.0 | 83.144 |
| 1510.0 | 83.716 |
| 1509.0 | 84.27 |
| 1508.0 | 84.777 |
| 1507.0 | 85.218 |
| 1506.0 | 85.446 |
| 1505.0 | 85.499 |
| 1504.0 | 85.392 |
| 1503.0 | 85.141 |
| 1502.0 | 84.696 |
| 1501.0 | 84.191 |
| 1500.0 | 83.611 |
| 1499.0 | 83.055 |
| 1498.0 | 82.497 |
| 1497.0 | 82.003 |
| 1496.0 | 81.61 |
| 1495.0 | 81.33 |
| 1494.0 | 81.193 |
| 1493.0 | 81.157 |
| 1492.0 | 81.196 |
| 1491.0 | 81.36 |
| 1490.0 | 81.503 |
| 1489.0 | 81.632 |
| 1488.0 | 81.715 |
| 1487.0 | 81.648 |
| 1486.0 | 81.424 |
| 1485.0 | 80.958 |
| 1484.0 | 80.391 |
| 1483.0 | 79.622 |
| 1482.0 | 78.68 |
| 1481.0 | 77.585 |
| 1480.0 | 76.472 |
| 1479.0 | 75.336 |
| 1478.0 | 74.396 |
| 1477.0 | 73.524 |
| 1476.0 | 72.859 |
| 1475.0 | 72.431 |
| 1474.0 | 72.304 |
| 1473.0 | 72.409 |
| 1472.0 | 72.776 |
| 1471.0 | 73.366 |
| 1470.0 | 74.151 |
| 1469.0 | 75.066 |
| 1468.0 | 75.992 |
| 1467.0 | 76.938 |
| 1466.0 | 77.64 |
| 1465.0 | 78.12 |
| 1464.0 | 78.253 |
| 1463.0 | 78.013 |
| 1462.0 | 77.467 |
| 1461.0 | 76.485 |
| 1460.0 | 75.212 |
| 1459.0 | 73.725 |
| 1458.0 | 72.075 |
| 1457.0 | 70.661 |
| 1456.0 | 69.184 |
| 1455.0 | 67.88 |
| 1454.0 | 66.826 |
| 1453.0 | 66.041 |
| 1452.0 | 65.577 |
| 1451.0 | 65.477 |
| 1450.0 | 65.668 |
| 1449.0 | 66.199 |
| 1448.0 | 67.047 |
| 1447.0 | 68.24 |
| 1446.0 | 69.584 |
| 1445.0 | 71.089 |
| 1444.0 | 72.546 |
| 1443.0 | 73.971 |
| 1442.0 | 75.271 |
| 1441.0 | 76.343 |
| 1440.0 | 77.024 |
| 1439.0 | 77.32 |
| 1438.0 | 77.185 |
| 1437.0 | 76.675 |
| 1436.0 | 75.91 |
| 1435.0 | 75.01 |
| 1434.0 | 74.063 |
| 1433.0 | 73.143 |
| 1432.0 | 72.387 |
| 1431.0 | 71.777 |
| 1430.0 | 71.429 |
| 1429.0 | 71.323 |
| 1428.0 | 71.447 |
| 1427.0 | 71.772 |
| 1426.0 | 72.225 |
| 1425.0 | 72.779 |
| 1424.0 | 73.341 |
| 1423.0 | 73.824 |
| 1422.0 | 74.124 |
| 1421.0 | 74.261 |
| 1420.0 | 74.163 |
| 1419.0 | 73.787 |
| 1418.0 | 73.209 |
| 1417.0 | 72.571 |
| 1416.0 | 71.879 |
| 1415.0 | 71.118 |
| 1414.0 | 70.32 |
| 1413.0 | 69.59 |
| 1412.0 | 69.072 |
| 1411.0 | 68.774 |
| 1410.0 | 68.591 |
| 1409.0 | 68.513 |
| 1408.0 | 68.442 |
| 1407.0 | 68.433 |
| 1406.0 | 68.38 |
| 1405.0 | 68.215 |
| 1404.0 | 67.807 |
| 1403.0 | 67.178 |
| 1402.0 | 66.42 |
| 1401.0 | 65.221 |
| 1400.0 | 63.589 |
| 1399.0 | 61.774 |
| 1398.0 | 60.282 |
| 1397.0 | 58.952 |
| 1396.0 | 57.382 |
| 1395.0 | 55.827 |
| 1394.0 | 54.762 |
| 1393.0 | 54.057 |
| 1392.0 | 53.71 |
| 1391.0 | 53.65 |
| 1390.0 | 53.914 |
| 1389.0 | 54.435 |
| 1388.0 | 55.103 |
| 1387.0 | 55.722 |
| 1386.0 | 56.142 |
| 1385.0 | 56.545 |
| 1384.0 | 56.662 |
| 1383.0 | 56.227 |
| 1382.0 | 55.302 |
| 1381.0 | 53.882 |
| 1380.0 | 52.417 |
| 1379.0 | 50.884 |
| 1378.0 | 49.279 |
| 1377.0 | 47.779 |
| 1376.0 | 46.347 |
| 1375.0 | 45.138 |
| 1374.0 | 44.165 |
| 1373.0 | 43.544 |
| 1372.0 | 43.255 |
| 1371.0 | 43.273 |
| 1370.0 | 43.594 |
| 1369.0 | 44.26 |
| 1368.0 | 45.355 |
| 1367.0 | 46.686 |
| 1366.0 | 48.084 |
| 1365.0 | 49.76 |
| 1364.0 | 51.251 |
| 1363.0 | 52.449 |
| 1362.0 | 53.437 |
| 1361.0 | 53.807 |
| 1360.0 | 53.62 |
| 1359.0 | 52.979 |
| 1358.0 | 52.063 |
| 1357.0 | 51.125 |
| 1356.0 | 50.007 |
| 1355.0 | 48.819 |
| 1354.0 | 47.711 |
| 1353.0 | 47.04 |
| 1352.0 | 46.754 |
| 1351.0 | 46.883 |
| 1350.0 | 47.391 |
| 1349.0 | 48.148 |
| 1348.0 | 49.147 |
| 1347.0 | 50.383 |
| 1346.0 | 51.74 |
| 1345.0 | 53.046 |
| 1344.0 | 54.108 |
| 1343.0 | 54.862 |
| 1342.0 | 55.268 |
| 1341.0 | 55.286 |
| 1340.0 | 54.946 |
| 1339.0 | 54.34 |
| 1338.0 | 53.57 |
| 1337.0 | 52.799 |
| 1336.0 | 52.148 |
| 1335.0 | 51.619 |
| 1334.0 | 51.334 |
| 1333.0 | 51.34 |
| 1332.0 | 51.645 |
| 1331.0 | 52.236 |
| 1330.0 | 53.079 |
| 1329.0 | 54.061 |
| 1328.0 | 55.071 |
| 1327.0 | 56.049 |
| 1326.0 | 56.826 |
| 1325.0 | 57.307 |
| 1324.0 | 57.4 |
| 1323.0 | 57.114 |
| 1322.0 | 56.466 |
| 1321.0 | 55.572 |
| 1320.0 | 54.567 |
| 1319.0 | 53.598 |
| 1318.0 | 52.829 |
| 1317.0 | 52.266 |
| 1316.0 | 51.99 |
| 1315.0 | 52.043 |
| 1314.0 | 52.393 |
| 1313.0 | 53.011 |
| 1312.0 | 53.802 |
| 1311.0 | 54.636 |
| 1310.0 | 55.317 |
| 1309.0 | 55.729 |
| 1308.0 | 55.773 |
| 1307.0 | 55.39 |
| 1306.0 | 54.584 |
| 1305.0 | 53.392 |
| 1304.0 | 52.003 |
| 1303.0 | 50.552 |
| 1302.0 | 49.161 |
| 1301.0 | 47.973 |
| 1300.0 | 47.052 |
| 1299.0 | 46.468 |
| 1298.0 | 46.237 |
| 1297.0 | 46.322 |
| 1296.0 | 46.71 |
| 1295.0 | 47.344 |
| 1294.0 | 48.151 |
| 1293.0 | 49.029 |
| 1292.0 | 49.825 |
| 1291.0 | 50.431 |
| 1290.0 | 50.756 |
| 1289.0 | 50.729 |
| 1288.0 | 50.336 |
| 1287.0 | 49.619 |
| 1286.0 | 48.663 |
| 1285.0 | 47.554 |
| 1284.0 | 46.47 |
| 1283.0 | 45.566 |
| 1282.0 | 44.866 |
| 1281.0 | 44.461 |
| 1280.0 | 44.368 |
| 1279.0 | 44.571 |
| 1278.0 | 45.065 |
| 1277.0 | 45.807 |
| 1276.0 | 46.703 |
| 1275.0 | 47.63 |
| 1274.0 | 48.537 |
| 1273.0 | 49.392 |
| 1272.0 | 50.036 |
| 1271.0 | 50.474 |
| 1270.0 | 50.684 |
| 1269.0 | 50.677 |
| 1268.0 | 50.525 |
| 1267.0 | 50.33 |
| 1266.0 | 50.183 |
| 1265.0 | 50.105 |
| 1264.0 | 50.084 |
| 1263.0 | 50.132 |
| 1262.0 | 50.242 |
| 1261.0 | 50.399 |
| 1260.0 | 50.541 |
| 1259.0 | 50.621 |
| 1258.0 | 50.615 |
| 1257.0 | 50.496 |
| 1256.0 | 50.285 |
| 1255.0 | 49.997 |
| 1254.0 | 49.656 |
| 1253.0 | 49.318 |
| 1252.0 | 49.048 |
| 1251.0 | 48.87 |
| 1250.0 | 48.774 |
| 1249.0 | 48.778 |
| 1248.0 | 48.875 |
| 1247.0 | 49.021 |
| 1246.0 | 49.149 |
| 1245.0 | 49.195 |
| 1244.0 | 49.08 |
| 1243.0 | 48.781 |
| 1242.0 | 48.295 |
| 1241.0 | 47.615 |
| 1240.0 | 46.835 |
| 1239.0 | 46.047 |
| 1238.0 | 45.325 |
| 1237.0 | 44.732 |
| 1236.0 | 44.308 |
| 1235.0 | 44.112 |
| 1234.0 | 44.171 |
| 1233.0 | 44.43 |
| 1232.0 | 44.837 |
| 1231.0 | 45.322 |
| 1230.0 | 45.779 |
| 1229.0 | 46.103 |
| 1228.0 | 46.204 |
| 1227.0 | 46.049 |
| 1226.0 | 45.644 |
| 1225.0 | 45.034 |
| 1224.0 | 44.303 |
| 1223.0 | 43.585 |
| 1222.0 | 42.929 |
| 1221.0 | 42.41 |
| 1220.0 | 42.109 |
| 1219.0 | 42.065 |
| 1218.0 | 42.254 |
| 1217.0 | 42.656 |
| 1216.0 | 43.279 |
| 1215.0 | 43.994 |
| 1214.0 | 44.722 |
| 1213.0 | 45.382 |
| 1212.0 | 45.905 |
| 1211.0 | 46.236 |
| 1210.0 | 46.342 |
| 1209.0 | 46.236 |
| 1208.0 | 45.985 |
| 1207.0 | 45.649 |
| 1206.0 | 45.313 |
| 1205.0 | 45.017 |
| 1204.0 | 44.826 |
| 1203.0 | 44.749 |
| 1202.0 | 44.766 |
| 1201.0 | 44.884 |
| 1200.0 | 45.057 |
| 1199.0 | 45.215 |
| 1198.0 | 45.291 |
| 1197.0 | 45.301 |
| 1196.0 | 45.258 |
| 1195.0 | 45.175 |
| 1194.0 | 45.058 |
| 1193.0 | 44.954 |
| 1192.0 | 44.886 |
| 1191.0 | 44.867 |
| 1190.0 | 44.901 |
| 1189.0 | 44.949 |
| 1188.0 | 44.977 |
| 1187.0 | 44.923 |
| 1186.0 | 44.742 |
| 1185.0 | 44.431 |
| 1184.0 | 43.993 |
| 1183.0 | 43.461 |
| 1182.0 | 42.887 |
| 1181.0 | 42.345 |
| 1180.0 | 41.908 |
| 1179.0 | 41.627 |
| 1178.0 | 41.54 |
| 1177.0 | 41.621 |
| 1176.0 | 41.856 |
| 1175.0 | 42.181 |
| 1174.0 | 42.543 |
| 1173.0 | 42.811 |
| 1172.0 | 42.911 |
| 1171.0 | 42.796 |
| 1170.0 | 42.445 |
| 1169.0 | 41.877 |
| 1168.0 | 41.174 |
| 1167.0 | 40.442 |
| 1166.0 | 39.693 |
| 1165.0 | 39.16 |
| 1164.0 | 38.873 |
| 1163.0 | 38.848 |
| 1162.0 | 39.062 |
| 1161.0 | 39.467 |
| 1160.0 | 40.01 |
| 1159.0 | 40.564 |
| 1158.0 | 41.055 |
| 1157.0 | 41.371 |
| 1156.0 | 41.465 |
| 1155.0 | 41.371 |
| 1154.0 | 41.105 |
| 1153.0 | 40.78 |
| 1152.0 | 40.453 |
| 1151.0 | 40.254 |
| 1150.0 | 40.238 |
| 1149.0 | 40.388 |
| 1148.0 | 40.691 |
| 1147.0 | 41.096 |
| 1146.0 | 41.535 |
| 1145.0 | 41.905 |
| 1144.0 | 42.214 |
| 1143.0 | 42.408 |
| 1142.0 | 42.536 |
| 1141.0 | 42.617 |
| 1140.0 | 42.679 |
| 1139.0 | 42.769 |
| 1138.0 | 42.899 |
| 1137.0 | 43.106 |
| 1136.0 | 43.329 |
| 1135.0 | 43.452 |
| 1134.0 | 43.385 |
| 1133.0 | 43.17 |
| 1132.0 | 42.775 |
| 1131.0 | 42.246 |
| 1130.0 | 41.612 |
| 1129.0 | 40.889 |
| 1128.0 | 40.326 |
| 1127.0 | 40.008 |
| 1126.0 | 40.001 |
| 1125.0 | 40.296 |
| 1124.0 | 40.833 |
| 1123.0 | 41.55 |
| 1122.0 | 42.261 |
| 1121.0 | 42.677 |
| 1120.0 | 42.625 |
| 1119.0 | 42.013 |
| 1118.0 | 40.915 |
| 1117.0 | 39.438 |
| 1116.0 | 37.868 |
| 1115.0 | 36.508 |
| 1114.0 | 35.507 |
| 1113.0 | 34.981 |
| 1112.0 | 34.957 |
| 1111.0 | 35.435 |
| 1110.0 | 36.31 |
| 1109.0 | 37.43 |
| 1108.0 | 38.622 |
| 1107.0 | 39.584 |
| 1106.0 | 40.119 |
| 1105.0 | 40.232 |
| 1104.0 | 39.943 |
| 1103.0 | 39.388 |
| 1102.0 | 38.799 |
| 1101.0 | 38.387 |
| 1100.0 | 38.281 |
| 1099.0 | 38.537 |
| 1098.0 | 39.162 |
| 1097.0 | 40.068 |
| 1096.0 | 41.126 |
| 1095.0 | 42.168 |
| 1094.0 | 43.095 |
| 1093.0 | 43.705 |
| 1092.0 | 44.027 |
| 1091.0 | 44.074 |
| 1090.0 | 43.948 |
| 1089.0 | 43.883 |
| 1088.0 | 43.936 |
| 1087.0 | 44.114 |
| 1086.0 | 44.392 |
| 1085.0 | 44.639 |
| 1084.0 | 44.716 |
| 1083.0 | 44.397 |
| 1082.0 | 43.755 |
| 1081.0 | 42.776 |
| 1080.0 | 41.588 |
| 1079.0 | 40.431 |
| 1078.0 | 39.438 |
| 1077.0 | 38.737 |
| 1076.0 | 38.275 |
| 1075.0 | 38.099 |
| 1074.0 | 38.042 |
| 1073.0 | 37.919 |
| 1072.0 | 37.638 |
| 1071.0 | 37.128 |
| 1070.0 | 36.474 |
| 1069.0 | 35.822 |
| 1068.0 | 35.228 |
| 1067.0 | 34.979 |
| 1066.0 | 35.079 |
| 1065.0 | 35.493 |
| 1064.0 | 36.082 |
| 1063.0 | 36.639 |
| 1062.0 | 36.836 |
| 1061.0 | 36.547 |
| 1060.0 | 35.671 |
| 1059.0 | 34.254 |
| 1058.0 | 32.881 |
| 1057.0 | 31.585 |
| 1056.0 | 30.684 |
| 1055.0 | 30.357 |
| 1054.0 | 30.688 |
| 1053.0 | 31.71 |
| 1052.0 | 33.311 |
| 1051.0 | 35.346 |
| 1050.0 | 37.323 |
| 1049.0 | 38.655 |
| 1048.0 | 39.203 |
| 1047.0 | 38.768 |
| 1046.0 | 37.697 |
| 1045.0 | 36.304 |
| 1044.0 | 35.326 |
| 1043.0 | 34.958 |
| 1042.0 | 35.509 |
| 1041.0 | 36.952 |
| 1040.0 | 39.243 |
| 1039.0 | 42.065 |
| 1038.0 | 44.526 |
| 1037.0 | 46.336 |
| 1036.0 | 46.989 |
| 1035.0 | 46.581 |
| 1034.0 | 45.584 |
| 1033.0 | 44.759 |
| 1032.0 | 44.464 |
| 1031.0 | 44.981 |
| 1030.0 | 46.228 |
| 1029.0 | 47.891 |
| 1028.0 | 49.295 |
| 1027.0 | 50.029 |
| 1026.0 | 49.717 |
| 1025.0 | 48.514 |
| 1024.0 | 46.95 |
| 1023.0 | 45.534 |
| 1022.0 | 44.849 |
| 1021.0 | 45.006 |
| 1020.0 | 45.97 |
| 1019.0 | 47.367 |
| 1018.0 | 48.607 |
| 1017.0 | 49.041 |
| 1016.0 | 48.396 |
| 1015.0 | 46.682 |
| 1014.0 | 44.28 |
| 1013.0 | 41.944 |
| 1012.0 | 40.164 |
| 1011.0 | 39.395 |
| 1010.0 | 39.62 |
| 1009.0 | 40.77 |
| 1008.0 | 42.605 |
| 1007.0 | 44.495 |
| 1006.0 | 45.804 |
| 1005.0 | 46.234 |
| 1004.0 | 45.673 |
| 1003.0 | 44.491 |
| 1002.0 | 43.409 |
| 1001.0 | 42.974 |
| 1000.0 | 43.572 |
| 999.0 | 45.269 |
| 998.0 | 47.78 |
| 997.0 | 50.415 |
| 996.0 | 52.636 |
| 995.0 | 53.727 |
| 994.0 | 53.607 |
| 993.0 | 52.702 |
| 992.0 | 51.687 |
| 991.0 | 51.16 |
| 990.0 | 51.409 |
| 989.0 | 52.293 |
| 988.0 | 53.385 |
| 987.0 | 54.022 |
| 986.0 | 53.757 |
| 985.0 | 52.608 |
| 984.0 | 50.996 |
| 983.0 | 49.369 |
| 982.0 | 48.24 |
| 981.0 | 47.906 |
| 980.0 | 48.18 |
| 979.0 | 48.677 |
| 978.0 | 48.885 |
| 977.0 | 48.39 |
| 976.0 | 47.089 |
| 975.0 | 45.227 |
| 974.0 | 43.219 |
| 973.0 | 41.88 |
| 972.0 | 41.271 |
| 971.0 | 41.495 |
| 970.0 | 42.418 |
| 969.0 | 43.595 |
| 968.0 | 44.452 |
| 967.0 | 44.537 |
| 966.0 | 43.789 |
| 965.0 | 42.611 |
| 964.0 | 41.489 |
| 963.0 | 40.987 |
| 962.0 | 41.475 |
| 961.0 | 43.038 |
| 960.0 | 45.384 |
| 959.0 | 47.745 |
| 958.0 | 49.798 |
| 957.0 | 51.032 |
| 956.0 | 51.447 |
| 955.0 | 51.708 |
| 954.0 | 52.434 |
| 953.0 | 53.979 |
| 952.0 | 56.296 |
| 951.0 | 58.855 |
| 950.0 | 60.629 |
| 949.0 | 61.2 |
| 948.0 | 60.54 |
| 947.0 | 59.399 |
| 946.0 | 58.671 |
| 945.0 | 59.123 |
| 944.0 | 60.695 |
| 943.0 | 62.658 |
| 942.0 | 64.01 |
| 941.0 | 63.606 |
| 940.0 | 61.21 |
| 939.0 | 57.739 |
| 938.0 | 54.312 |
| 937.0 | 51.716 |
| 936.0 | 50.668 |
| 935.0 | 50.673 |
| 934.0 | 50.697 |
| 933.0 | 49.656 |
| 932.0 | 47.018 |
| 931.0 | 43.029 |
| 930.0 | 38.494 |
| 929.0 | 34.687 |
| 928.0 | 32.184 |
| 927.0 | 31.681 |
| 926.0 | 33.153 |
| 925.0 | 36.11 |
| 924.0 | 39.514 |
| 923.0 | 41.706 |
| 922.0 | 41.974 |
| 921.0 | 40.341 |
| 920.0 | 37.641 |
| 919.0 | 35.354 |
| 918.0 | 34.727 |
| 917.0 | 36.271 |
| 916.0 | 39.673 |
| 915.0 | 44.1 |
| 914.0 | 48.281 |
| 913.0 | 50.527 |
| 912.0 | 50.807 |
| 911.0 | 49.78 |
| 910.0 | 48.755 |
| 909.0 | 49.167 |
| 908.0 | 51.648 |
| 907.0 | 56.177 |
| 906.0 | 62.009 |
| 905.0 | 67.458 |
| 904.0 | 71.53 |
| 903.0 | 73.705 |
| 902.0 | 74.02 |
| 901.0 | 73.008 |
| 900.0 | 71.311 |
| 899.0 | 69.692 |
| 898.0 | 68.687 |
| 897.0 | 68.612 |
| 896.0 | 69.591 |
| 895.0 | 71.324 |
| 894.0 | 72.949 |
| 893.0 | 73.583 |
| 892.0 | 72.485 |
| 891.0 | 69.434 |
| 890.0 | 65.051 |
| 889.0 | 60.317 |
| 888.0 | 56.508 |
| 887.0 | 54.894 |
| 886.0 | 55.489 |
| 885.0 | 57.435 |
| 884.0 | 59.548 |
| 883.0 | 60.576 |
| 882.0 | 59.715 |
| 881.0 | 57.388 |
| 880.0 | 54.867 |
| 879.0 | 53.575 |
| 878.0 | 54.276 |
| 877.0 | 56.928 |
| 876.0 | 60.768 |
| 875.0 | 64.868 |
| 874.0 | 68.262 |
| 873.0 | 70.531 |
| 872.0 | 72.09 |
| 871.0 | 73.338 |
| 870.0 | 74.389 |
| 869.0 | 75.203 |
| 868.0 | 75.715 |
| 867.0 | 75.718 |
| 866.0 | 75.13 |
| 865.0 | 74.214 |
| 864.0 | 73.163 |
| 863.0 | 71.955 |
| 862.0 | 70.555 |
| 861.0 | 68.825 |
| 860.0 | 73.936 |
| 859.0 | 77.672 |
| 858.0 | 70.512 |
| 857.0 | 59.262 |
| 856.0 | 50.075 |
| 855.0 | 46.147 |
| 854.0 | 47.621 |
| 853.0 | 53.137 |
| 852.0 | 59.635 |
| 851.0 | 62.769 |
| 850.0 | 60.215 |
| 849.0 | 54.187 |
| 848.0 | 49.194 |
| 847.0 | 48.517 |
| 846.0 | 53.657 |
| 845.0 | 64.303 |
| 844.0 | 77.014 |
| 843.0 | 85.563 |
| 842.0 | 85.847 |
| 841.0 | 80.234 |
| 840.0 | 74.622 |
| 839.0 | 73.188 |
| 838.0 | 76.586 |
| 837.0 | 82.822 |
| 836.0 | 88.504 |
| 835.0 | 91.402 |
| 834.0 | 92.326 |
| 833.0 | 93.302 |
| 832.0 | 95.062 |
| 831.0 | 96.057 |
| 830.0 | 93.691 |
| 829.0 | 87.307 |
| 828.0 | 79.607 |
| 827.0 | 74.325 |
| 826.0 | 73.816 |
| 825.0 | 78.031 |
| 824.0 | 84.218 |
| 823.0 | 87.879 |
| 822.0 | 86.176 |
| 821.0 | 80.216 |
| 820.0 | 73.961 |
| 819.0 | 71.043 |
| 818.0 | 72.93 |
| 817.0 | 78.872 |
| 816.0 | 86.263 |
| 815.0 | 91.607 |
| 814.0 | 93.13 |
| 813.0 | 92.092 |
| 812.0 | 90.988 |
| 811.0 | 91.374 |
| 810.0 | 93.375 |
| 809.0 | 95.88 |
| 808.0 | 97.516 |
| 807.0 | 98.038 |
| 806.0 | 98.055 |
| 805.0 | 98.168 |
| 804.0 | 98.586 |
| 803.0 | 98.981 |
| 802.0 | 99.091 |
| 801.0 | 99.124 |
| 800.0 | 99.174 |
| 799.0 | 99.307 |
| 798.0 | 99.399 |
| 797.0 | 99.117 |
| 796.0 | 98.599 |
| 795.0 | 98.334 |
| 794.0 | 98.512 |
| 793.0 | 98.979 |
| 792.0 | 99.361 |
| 791.0 | 99.216 |
| 790.0 | 98.571 |
| 789.0 | 98.044 |
| 788.0 | 98.098 |
| 787.0 | 98.618 |
| 786.0 | 99.095 |
| 785.0 | 99.008 |
| 784.0 | 98.392 |
| 783.0 | 97.904 |
| 782.0 | 97.941 |
| 781.0 | 98.387 |
| 780.0 | 98.992 |
| 779.0 | 99.223 |
| 778.0 | 99.052 |
| 777.0 | 98.942 |
| 776.0 | 99.044 |
| 775.0 | 99.265 |
| 774.0 | 99.406 |
| 773.0 | 99.186 |
| 772.0 | 98.863 |
| 771.0 | 98.849 |
| 770.0 | 99.107 |
| 769.0 | 99.339 |
| 768.0 | 99.331 |
| 767.0 | 98.983 |
| 766.0 | 98.658 |
| 765.0 | 98.745 |
| 764.0 | 99.11 |
| 763.0 | 99.376 |
| 762.0 | 99.363 |
| 761.0 | 99.108 |
| 760.0 | 98.92 |
| 759.0 | 99.104 |
| 758.0 | 99.425 |
| 757.0 | 99.443 |
| 756.0 | 99.362 |
| 755.0 | 99.283 |
| 754.0 | 99.296 |
| 753.0 | 99.39 |
| 752.0 | 99.173 |
| 751.0 | 98.599 |
| 750.0 | 98.15 |
| 749.0 | 98.185 |
| 748.0 | 98.614 |
| 747.0 | 99.166 |
| 746.0 | 99.306 |
| 745.0 | 99.028 |
| 744.0 | 98.871 |
| 743.0 | 98.981 |
| 742.0 | 99.135 |
| 741.0 | 99.296 |
| 740.0 | 99.225 |
| 739.0 | 99.102 |
| 738.0 | 99.237 |
| 737.0 | 99.451 |
| 736.0 | 99.493 |
| 735.0 | 99.476 |
| 734.0 | 99.441 |
| 733.0 | 99.439 |
| 732.0 | 99.48 |
| 731.0 | 99.233 |
| 730.0 | 98.829 |
| 729.0 | 98.698 |
| 728.0 | 98.929 |
| 727.0 | 99.294 |
| 726.0 | 99.486 |
| 725.0 | 99.396 |
| 724.0 | 99.28 |
| 723.0 | 99.467 |
| 722.0 | 99.548 |
| 721.0 | 99.353 |
| 720.0 | 99.102 |
| 719.0 | 98.974 |
| 718.0 | 99.173 |
| 717.0 | 99.476 |
| 716.0 | 99.381 |
| 715.0 | 98.987 |
| 714.0 | 98.927 |
| 713.0 | 99.2 |
| 712.0 | 99.42 |
| 711.0 | 99.429 |
| 710.0 | 99.12 |
| 709.0 | 99.417 |
| 708.0 | 99.712 |
| 707.0 | 99.625 |
| 706.0 | 98.518 |
| 705.0 | 98.452 |
| 704.0 | 98.142 |
| 703.0 | 99.012 |
| 702.0 | 99.491 |
| 701.0 | 99.268 |
| 700.0 | 98.491 |
| 699.0 | 98.791 |
| 698.0 | 99.551 |
| 697.0 | 99.997 |
| 696.0 | 98.803 |
| 695.0 | 99.152 |
| 694.0 | 99.293 |
| 693.0 | 99.276 |
| 692.0 | 98.884 |
| 691.0 | 99.032 |
| 690.0 | 99.521 |
| 689.0 | 99.459 |
| 688.0 | 98.591 |
| 687.0 | 98.143 |
| 686.0 | 98.577 |
| 685.0 | 99.94 |
| 684.0 | 99.533 |
| 683.0 | 98.907 |
| 682.0 | 98.477 |
| 681.0 | 98.874 |
| 680.0 | 99.057 |
| 679.0 | 99.399 |
| 678.0 | 98.788 |
| 677.0 | 99.599 |
| 676.0 | 99.432 |
| 675.0 | 98.846 |
| 674.0 | 98.935 |
| 673.0 | 98.789 |
| 672.0 | 99.068 |
| 671.0 | 98.963 |
| 670.0 | 98.567 |
| 669.0 | 98.775 |
| 668.0 | 99.19 |
| 667.0 | 99.136 |
| 666.0 | 98.9 |
| 665.0 | 98.517 |
| 664.0 | 99.07 |
| 663.0 | 99.727 |
| 662.0 | 99.002 |
| 661.0 | 98.181 |
| 660.0 | 98.917 |
| 659.0 | 99.185 |
| 658.0 | 99.046 |
| 657.0 | 99.232 |
| 656.0 | 98.906 |
| 655.0 | 99.779 |
| 654.0 | 99.907 |
| 653.0 | 99.101 |
| 652.0 | 98.924 |
| 651.0 | 99.242 |
| 650.0 | 98.617 |
| 649.0 | 98.152 |
| 648.0 | 98.964 |
| 647.0 | 99.174 |
| 646.0 | 98.62 |
| 645.0 | 98.609 |
| 644.0 | 99.337 |
| 643.0 | 99.551 |
| 642.0 | 99.645 |
| 641.0 | 99.702 |
| 640.0 | 99.197 |
| 639.0 | 99.494 |
| 638.0 | 99.213 |
| 637.0 | 99.293 |
| 636.0 | 99.457 |
| 635.0 | 99.39 |
| 634.0 | 99.424 |
| 633.0 | 99.93 |
| 632.0 | 98.468 |
| 631.0 | 97.799 |
| 630.0 | 98.632 |
| 629.0 | 99.178 |
| 628.0 | 99.575 |
| 627.0 | 99.427 |
| 626.0 | 99.081 |
| 625.0 | 99.561 |
| 624.0 | 99.939 |
| 623.0 | 99.387 |
| 622.0 | 99.849 |
| 621.0 | 99.839 |
| 620.0 | 99.236 |
| 619.0 | 99.484 |
| 618.0 | 99.644 |
| 617.0 | 99.332 |
| 616.0 | 98.962 |
| 615.0 | 99.36 |
| 614.0 | 99.263 |
| 613.0 | 98.238 |
| 612.0 | 98.384 |
| 611.0 | 99.138 |
| 610.0 | 99.519 |
| 609.0 | 99.451 |
| 608.0 | 99.785 |
| 607.0 | 98.784 |
| 606.0 | 98.993 |
| 605.0 | 99.233 |
| 604.0 | 99.377 |
| 603.0 | 99.29 |
| 602.0 | 98.667 |
| 601.0 | 98.885 |
| 600.0 | 99.377 |
| 599.0 | 98.64 |
| 598.0 | 98.725 |
| 597.0 | 99.57 |
| 596.0 | 98.974 |
| 595.0 | 98.315 |
| 594.0 | 98.491 |
| 593.0 | 98.791 |
| 592.0 | 99.113 |
| 591.0 | 98.6 |
| 590.0 | 98.227 |
| 589.0 | 98.893 |
| 588.0 | 99.071 |
| 587.0 | 98.178 |
| 586.0 | 98.202 |
| 585.0 | 98.435 |
| 584.0 | 98.323 |
| 583.0 | 98.506 |
| 582.0 | 98.839 |
| 581.0 | 98.758 |
| 580.0 | 98.337 |
| 579.0 | 98.729 |
| 578.0 | 98.966 |
| 577.0 | 98.807 |
| 576.0 | 98.64 |
| 575.0 | 98.698 |
| 574.0 | 98.486 |
| 573.0 | 98.502 |
| 572.0 | 98.645 |
| 571.0 | 98.151 |
| 570.0 | 98.102 |
| 569.0 | 98.501 |
| 568.0 | 97.94 |
| 567.0 | 97.905 |
| 566.0 | 97.864 |
| 565.0 | 97.683 |
| 564.0 | 98.225 |
| 563.0 | 98.164 |
| 562.0 | 97.936 |
| 561.0 | 98.177 |
| 560.0 | 97.875 |
| 559.0 | 97.906 |
| 558.0 | 98.439 |
| 557.0 | 97.758 |
| 556.0 | 97.634 |
| 555.0 | 97.437 |
| 554.0 | 96.746 |
| 553.0 | 97.882 |
| 552.0 | 98.964 |
| 551.0 | 98.914 |
| 550.0 | 98.039 |
| 549.0 | 97.778 |
| 548.0 | 98.854 |
| 547.0 | 98.448 |
| 546.0 | 97.389 |
| 545.0 | 95.623 |
| 544.0 | 90.112 |
| 543.0 | 73.706 |
| 542.0 | 44.236 |
| 541.0 | 14.555 |
| 540.0 | 0.224 |
| 539.0 | 0.027 |
| 538.0 | 0.005 |
| 537.0 | 0.001 |
| 536.0 | 0 |
| 535.0 | 0 |
| 534.0 | 0 |
| 533.0 | 0 |
| 532.0 | 0 |
| 531.0 | 0 |
| 530.0 | 0.005 |
| 529.0 | 0.034 |
| 528.0 | 0.482 |
| 527.0 | 14.976 |
| 526.0 | 58.063 |
| 525.0 | 92.408 |
| 524.0 | 96.076 |
| 523.0 | 96.144 |
| 522.0 | 97.398 |
| 521.0 | 98.174 |
| 520.0 | 98.652 |
| 519.0 | 98.577 |
| 518.0 | 98.33 |
| 517.0 | 98.089 |
| 516.0 | 97.974 |
| 515.0 | 96.982 |
| 514.0 | 95.873 |
| 513.0 | 96.485 |
| 512.0 | 96.426 |
| 511.0 | 96.615 |
| 510.0 | 96.665 |
| 509.0 | 96.722 |
| 508.0 | 96.898 |
| 507.0 | 97.103 |
| 506.0 | 97.128 |
| 505.0 | 97.063 |
| 504.0 | 97.359 |
| 503.0 | 97.49 |
| 502.0 | 97.218 |
| 501.0 | 97.108 |
| 500.0 | 97.209 |
| 499.0 | 97.085 |
| 498.0 | 97.703 |
| 497.0 | 97.909 |
| 496.0 | 97.36 |
| 495.0 | 97.294 |
| 494.0 | 97.519 |
| 493.0 | 97.649 |
| 492.0 | 97.912 |
| 491.0 | 97.974 |
| 490.0 | 97.816 |
| 489.0 | 97.94 |
| 488.0 | 98.059 |
| 487.0 | 98.02 |
| 486.0 | 97.716 |
| 485.0 | 97.84 |
| 484.0 | 98.079 |
| 483.0 | 98.072 |
| 482.0 | 98.122 |
| 481.0 | 98.268 |
| 480.0 | 98.131 |
| 479.0 | 97.886 |
| 478.0 | 97.424 |
| 477.0 | 97.552 |
| 476.0 | 97.907 |
| 475.0 | 98.283 |
| 474.0 | 97.83 |
| 473.0 | 97.661 |
| 472.0 | 98.016 |
| 471.0 | 98.067 |
| 470.0 | 97.96 |
| 469.0 | 97.274 |
| 468.0 | 96.816 |
| 467.0 | 97.028 |
| 466.0 | 97.544 |
| 465.0 | 97.852 |
| 464.0 | 97.498 |
| 463.0 | 97.067 |
| 462.0 | 97.209 |
| 461.0 | 96.859 |
| 460.0 | 96.835 |
| 459.0 | 97.272 |
| 458.0 | 97.771 |
| 457.0 | 97.377 |
| 456.0 | 97.027 |
| 455.0 | 97.082 |
| 454.0 | 96.911 |
| 453.0 | 97.136 |
| 452.0 | 97.569 |
| 451.0 | 97.386 |
| 450.0 | 97.474 |
| 449.0 | 97.047 |
| 448.0 | 96.321 |
| 447.0 | 96.329 |
| 446.0 | 96.571 |
| 445.0 | 96.687 |
| 444.0 | 96.835 |
| 443.0 | 97.274 |
| 442.0 | 96.664 |
| 441.0 | 96.78 |
| 440.0 | 97.131 |
| 439.0 | 97.225 |
| 438.0 | 96.525 |
| 437.0 | 96.511 |
| 436.0 | 96.105 |
| 435.0 | 95.834 |
| 434.0 | 95.808 |
| 433.0 | 96.033 |
| 432.0 | 97.142 |
| 431.0 | 96.585 |
| 430.0 | 95.568 |
| 429.0 | 95.785 |
| 428.0 | 96.001 |
| 427.0 | 96.261 |
| 426.0 | 96.137 |
| 425.0 | 95.739 |
| 424.0 | 95.589 |
| 423.0 | 95.791 |
| 422.0 | 95.822 |
| 421.0 | 96.318 |
| 420.0 | 96.165 |
| 419.0 | 95.876 |
| 418.0 | 95.866 |
| 417.0 | 96.007 |
| 416.0 | 95.968 |
| 415.0 | 94.84 |
| 414.0 | 94.588 |
| 413.0 | 94.53 |
| 412.0 | 94.64 |
| 411.0 | 93.816 |
| 410.0 | 93.942 |
| 409.0 | 93.795 |
| 408.0 | 92.931 |
| 407.0 | 92.936 |
| 406.0 | 92.727 |
| 405.0 | 92.704 |
| 404.0 | 92.857 |
| 403.0 | 91.523 |
| 402.0 | 90.589 |
| 401.0 | 90.357 |
| 400.0 | 90.538 |
| 399.0 | 86.887 |
| 398.0 | 86.429 |
| 397.0 | 85.664 |
| 396.0 | 84.636 |
| 395.0 | 83.255 |
| 394.0 | 81.36 |
| 393.0 | 79.146 |
| 392.0 | 77.319 |
| 391.0 | 76.082 |
| 390.0 | 74.832 |
| 389.0 | 72.391 |
| 388.0 | 64.832 |
| 387.0 | 49.433 |
| 386.0 | 30.631 |
| 385.0 | 15.417 |
| 384.0 | 6.371 |
| 383.0 | 2.072 |
| 382.0 | 0.472 |
| 381.0 | 0.062 |
| 380.0 | 0.004 |
| 379.0 | 0.001 |
| 378.0 | 0.004 |
| 377.0 | 0.004 |
| 376.0 | 0.003 |
| 375.0 | 0.002 |
| 374.0 | 0.003 |
| 373.0 | 0.001 |
| 372.0 | 0.001 |
| 371.0 | 0.004 |
| 370.0 | 0.005 |
| 369.0 | 0.002 |
| 368.0 | 0.003 |
| 367.0 | 0.001 |
| 366.0 | 0 |
| 365.0 | 0.004 |
| 364.0 | 0.005 |
| 363.0 | 0.002 |
| 362.0 | 0.003 |
| 361.0 | 0.002 |
| 360.0 | 0.001 |
| 359.0 | 0.005 |
| 358.0 | 0.006 |
| 357.0 | 0.006 |
| 356.0 | 0.005 |
| 355.0 | 0.004 |
| 354.0 | 0.001 |
| 353.0 | 0.005 |
| 352.0 | 0.006 |
| 351.0 | 0.002 |
| 350.0 | 0.005 |
| 349.0 | 0.001 |
| 348.0 | 0.001 |
| 347.0 | 0.005 |
| 346.0 | 0.005 |
| 345.0 | 0.005 |
| 344.0 | 0.005 |
| 343.0 | 0.002 |
| 342.0 | 0.001 |
| 341.0 | 0.004 |
| 340.0 | 0.007 |
| 339.0 | 0.005 |
| 338.0 | 0.004 |
| 337.0 | 0.001 |
| 336.0 | 0.001 |
| 335.0 | 0.005 |
| 334.0 | 0.006 |
| 333.0 | 0.002 |
| 332.0 | 0.005 |
| 331.0 | 0.002 |
| 330.0 | 0.002 |
| 329.0 | 0.004 |
| 328.0 | 0.006 |
| 327.0 | 0.004 |
| 326.0 | 0.005 |
| 325.0 | 0.002 |
| 324.0 | 0.002 |
| 323.0 | 0.004 |
| 322.0 | 0.007 |
| 321.0 | 0.001 |
| 320.0 | 0.006 |
| 319.0 | 0.001 |
| 318.0 | 0.003 |
| 317.0 | 0.006 |
| 316.0 | 0.005 |
| 315.0 | 0.003 |
| 314.0 | 0.004 |
| 313.0 | 0.002 |
| 312.0 | 0 |
| 311.0 | 0.004 |
| 310.0 | 0.006 |
| 309.0 | 0.002 |
| 308.0 | 0.004 |
| 307.0 | 0.003 |
| 306.0 | 0 |
| 305.0 | 0.005 |
| 304.0 | 0.005 |
| 303.0 | 0.003 |
| 302.0 | 0.004 |
| 301.0 | 0.001 |
| 300.0 | 0 |
| 299.0 | 0.004 |
| 298.0 | 0.005 |
| 297.0 | 0.003 |
| 296.0 | 0.004 |
| 295.0 | 0.001 |
| 294.0 | 0.001 |
| 293.0 | 0.004 |
| 292.0 | 0.006 |
| 291.0 | 0.002 |
| 290.0 | 0.006 |
| 289.0 | 0.001 |
| 288.0 | 0.001 |
| 287.0 | 0.005 |
| 286.0 | 0.006 |
| 285.0 | 0.003 |
| 284.0 | 0.006 |
| 283.0 | 0 |
| 282.0 | 0.002 |
| 281.0 | 0.004 |
| 280.0 | 0.007 |
| 279.0 | 0 |
| 278.0 | 0.006 |
| 277.0 | 0 |
| 276.0 | 0.001 |
| 275.0 | 0.004 |
| 274.0 | 0.006 |
| 273.0 | 0.001 |
| 272.0 | 0.007 |
| 271.0 | 0 |
| 270.0 | 0.004 |
| 269.0 | 0.005 |
| 268.0 | 0.006 |
| 267.0 | 0.003 |
| 266.0 | 0.003 |
| 265.0 | 0.001 |
| 264.0 | 0.002 |
| 263.0 | 0.005 |
| 262.0 | 0.006 |
| 261.0 | 0.003 |
| 260.0 | 0.007 |
| 259.0 | 0 |
| 258.0 | 0.001 |
| 257.0 | 0.006 |
| 256.0 | 0.007 |
| 255.0 | 0.006 |
| 254.0 | 0.005 |
| 253.0 | 0.001 |
| 252.0 | 0.002 |
| 251.0 | 0.006 |
| 250.0 | 0.008 |
| 249.0 | 0.002 |
| 248.0 | 0.006 |
| 247.0 | 0.001 |
| 246.0 | 0 |
| 245.0 | 0.006 |
| 244.0 | 0.006 |
| 243.0 | 0.003 |
| 242.0 | 0.005 |
| 241.0 | 0.001 |
| 240.0 | 0.002 |
| 239.0 | 0.006 |
| 238.0 | 0.007 |
| 237.0 | 0.004 |
| 236.0 | 0.003 |
| 235.0 | 0.002 |
| 234.0 | 0.001 |
| 233.0 | 0.007 |
| 232.0 | 0.006 |
| 231.0 | 0.004 |
| 230.0 | 0.005 |
| 229.0 | 0.002 |
| 228.0 | 0.002 |
| 227.0 | 0.007 |
| 226.0 | 0.005 |
| 225.0 | 0.004 |
| 224.0 | 0.005 |
| 223.0 | 0.003 |
| 222.0 | 0.002 |
| 221.0 | 0.006 |
| 220.0 | 0.006 |
| 219.0 | 0.004 |
| 218.0 | 0.004 |
| 217.0 | 0.002 |
| 216.0 | 0.002 |
| 215.0 | 0.008 |
| 214.0 | 0.006 |
| 213.0 | 0.005 |
| 212.0 | 0.006 |
| 211.0 | 0.002 |
| 210.0 | 0.004 |
| 209.0 | 0.007 |
| 208.0 | 0.008 |
| 207.0 | 0.004 |
| 206.0 | 0.006 |
| 205.0 | 0.003 |
| 204.0 | 0.005 |
| 203.0 | 0.01 |
| 202.0 | 0.01 |
| 201.0 | 0.006 |